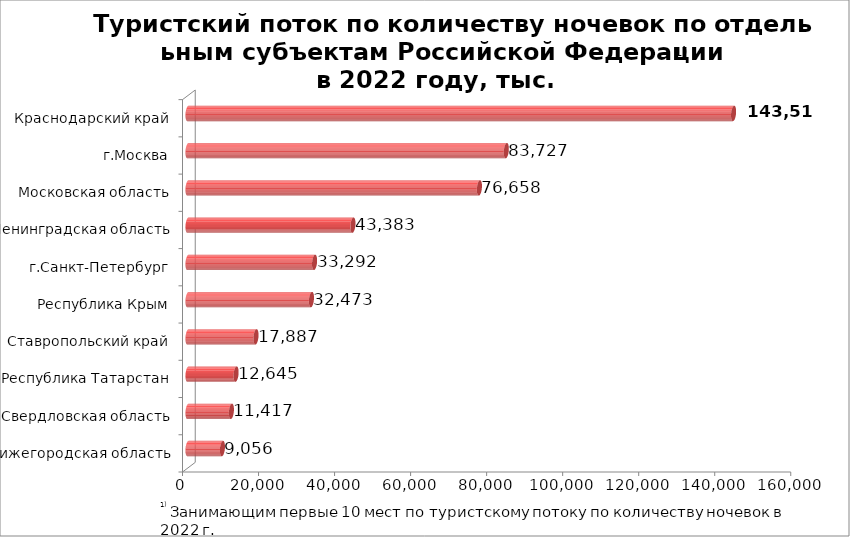
| Category | Series 0 |
|---|---|
| Нижегородская область | 9056.054 |
| Свердловская область | 11416.508 |
| Республика Татарстан | 12644.821 |
| Ставропольский край | 17887.151 |
| Республика Крым | 32473.036 |
| г.Санкт-Петербург | 33292.249 |
| Ленинградская область | 43383.329 |
| Московская область | 76657.552 |
| г.Москва | 83726.568 |
| Краснодарский край | 143509.668 |